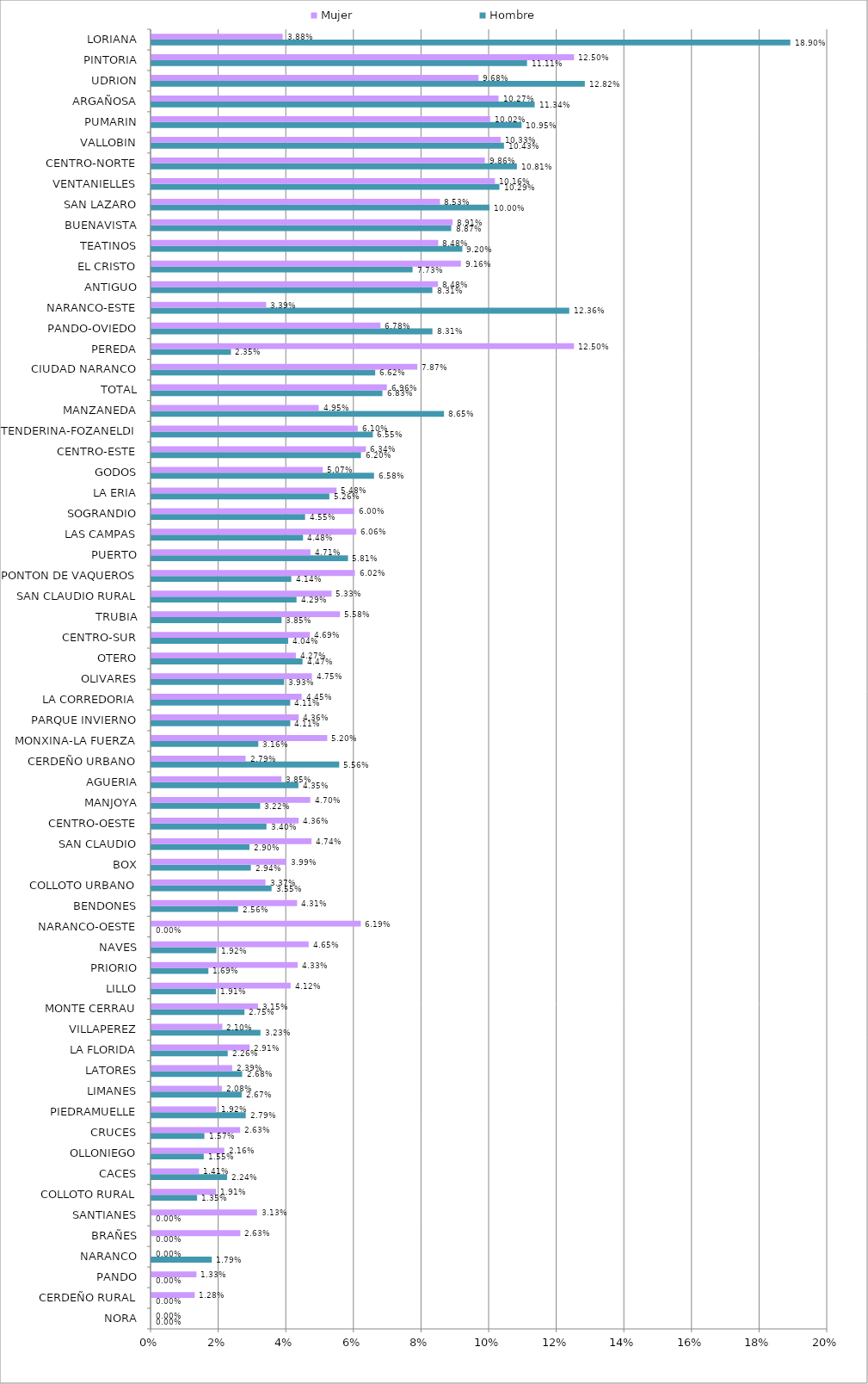
| Category | Hombre | Mujer |
|---|---|---|
| NORA | 0 | 0 |
| CERDEÑO RURAL | 0 | 0.013 |
| PANDO | 0 | 0.013 |
| NARANCO | 0.018 | 0 |
| BRAÑES | 0 | 0.026 |
| SANTIANES | 0 | 0.031 |
| COLLOTO RURAL | 0.014 | 0.019 |
| CACES | 0.022 | 0.014 |
| OLLONIEGO | 0.015 | 0.022 |
| CRUCES | 0.016 | 0.026 |
| PIEDRAMUELLE | 0.028 | 0.019 |
| LIMANES | 0.027 | 0.021 |
| LATORES | 0.027 | 0.024 |
| LA FLORIDA | 0.023 | 0.029 |
| VILLAPEREZ | 0.032 | 0.021 |
| MONTE CERRAU | 0.028 | 0.032 |
| LILLO | 0.019 | 0.041 |
| PRIORIO | 0.017 | 0.043 |
| NAVES | 0.019 | 0.047 |
| NARANCO-OESTE | 0 | 0.062 |
| BENDONES | 0.026 | 0.043 |
| COLLOTO URBANO | 0.036 | 0.034 |
| BOX | 0.029 | 0.04 |
| SAN CLAUDIO | 0.029 | 0.047 |
| CENTRO-OESTE | 0.034 | 0.044 |
| MANJOYA | 0.032 | 0.047 |
| AGUERIA | 0.043 | 0.038 |
| CERDEÑO URBANO | 0.056 | 0.028 |
| MONXINA-LA FUERZA | 0.032 | 0.052 |
| PARQUE INVIERNO | 0.041 | 0.044 |
| LA CORREDORIA | 0.041 | 0.044 |
| OLIVARES | 0.039 | 0.047 |
| OTERO | 0.045 | 0.043 |
| CENTRO-SUR | 0.04 | 0.047 |
| TRUBIA | 0.039 | 0.056 |
| SAN CLAUDIO RURAL | 0.043 | 0.053 |
| PONTON DE VAQUEROS | 0.041 | 0.06 |
| PUERTO | 0.058 | 0.047 |
| LAS CAMPAS | 0.045 | 0.061 |
| SOGRANDIO | 0.045 | 0.06 |
| LA ERIA | 0.053 | 0.055 |
| GODOS | 0.066 | 0.051 |
| CENTRO-ESTE | 0.062 | 0.063 |
| TENDERINA-FOZANELDI | 0.066 | 0.061 |
| MANZANEDA | 0.087 | 0.05 |
| TOTAL | 0.068 | 0.07 |
| CIUDAD NARANCO | 0.066 | 0.079 |
| PEREDA | 0.024 | 0.125 |
| PANDO-OVIEDO | 0.083 | 0.068 |
| NARANCO-ESTE | 0.124 | 0.034 |
| ANTIGUO | 0.083 | 0.085 |
| EL CRISTO | 0.077 | 0.092 |
| TEATINOS | 0.092 | 0.085 |
| BUENAVISTA | 0.089 | 0.089 |
| SAN LAZARO | 0.1 | 0.085 |
| VENTANIELLES | 0.103 | 0.102 |
| CENTRO-NORTE | 0.108 | 0.099 |
| VALLOBIN | 0.104 | 0.103 |
| PUMARIN | 0.109 | 0.1 |
| ARGAÑOSA | 0.113 | 0.103 |
| UDRION | 0.128 | 0.097 |
| PINTORIA | 0.111 | 0.125 |
| LORIANA | 0.189 | 0.039 |